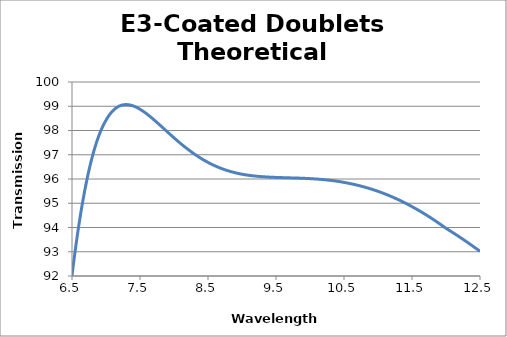
| Category | Transmission |
|---|---|
| 6.5 | 92.016 |
| 6.51 | 92.244 |
| 6.52 | 92.467 |
| 6.53 | 92.685 |
| 6.54 | 92.899 |
| 6.55 | 93.107 |
| 6.56 | 93.311 |
| 6.57 | 93.511 |
| 6.58 | 93.706 |
| 6.59 | 93.896 |
| 6.6 | 94.082 |
| 6.61 | 94.263 |
| 6.62 | 94.441 |
| 6.63 | 94.613 |
| 6.64 | 94.782 |
| 6.65 | 94.946 |
| 6.66 | 95.106 |
| 6.67 | 95.262 |
| 6.68 | 95.413 |
| 6.69 | 95.561 |
| 6.7 | 95.705 |
| 6.71 | 95.845 |
| 6.72 | 95.981 |
| 6.73 | 96.113 |
| 6.74 | 96.241 |
| 6.75 | 96.365 |
| 6.76 | 96.486 |
| 6.77 | 96.603 |
| 6.78 | 96.717 |
| 6.79 | 96.827 |
| 6.8 | 96.934 |
| 6.81 | 97.037 |
| 6.82 | 97.137 |
| 6.83 | 97.234 |
| 6.84 | 97.327 |
| 6.85 | 97.417 |
| 6.86 | 97.504 |
| 6.87 | 97.588 |
| 6.88 | 97.669 |
| 6.89 | 97.747 |
| 6.9 | 97.822 |
| 6.91 | 97.894 |
| 6.92 | 97.963 |
| 6.93 | 98.03 |
| 6.94 | 98.094 |
| 6.95 | 98.155 |
| 6.96 | 98.213 |
| 6.97 | 98.269 |
| 6.98 | 98.323 |
| 6.99 | 98.374 |
| 7.0 | 98.422 |
| 7.01 | 98.471 |
| 7.02 | 98.517 |
| 7.03 | 98.561 |
| 7.04 | 98.603 |
| 7.05 | 98.642 |
| 7.06 | 98.68 |
| 7.07 | 98.716 |
| 7.08 | 98.749 |
| 7.09 | 98.781 |
| 7.1 | 98.81 |
| 7.11 | 98.838 |
| 7.12 | 98.864 |
| 7.13 | 98.889 |
| 7.14 | 98.911 |
| 7.15 | 98.932 |
| 7.16 | 98.951 |
| 7.17 | 98.969 |
| 7.18 | 98.985 |
| 7.19 | 99 |
| 7.2 | 99.013 |
| 7.21 | 99.024 |
| 7.22 | 99.034 |
| 7.23 | 99.043 |
| 7.24 | 99.05 |
| 7.25 | 99.057 |
| 7.26 | 99.061 |
| 7.27 | 99.065 |
| 7.28 | 99.067 |
| 7.29 | 99.068 |
| 7.3 | 99.069 |
| 7.31 | 99.067 |
| 7.32 | 99.065 |
| 7.33 | 99.062 |
| 7.34 | 99.058 |
| 7.35 | 99.053 |
| 7.36 | 99.047 |
| 7.37 | 99.04 |
| 7.38 | 99.032 |
| 7.39 | 99.023 |
| 7.4 | 99.013 |
| 7.41 | 99.003 |
| 7.42 | 98.992 |
| 7.43 | 98.98 |
| 7.44 | 98.967 |
| 7.45 | 98.953 |
| 7.46 | 98.939 |
| 7.47 | 98.924 |
| 7.48 | 98.909 |
| 7.49 | 98.893 |
| 7.5 | 98.876 |
| 7.51 | 98.859 |
| 7.52 | 98.842 |
| 7.53 | 98.823 |
| 7.54 | 98.805 |
| 7.55 | 98.785 |
| 7.56 | 98.766 |
| 7.57 | 98.746 |
| 7.58 | 98.725 |
| 7.59 | 98.704 |
| 7.6 | 98.683 |
| 7.61 | 98.662 |
| 7.62 | 98.64 |
| 7.63 | 98.617 |
| 7.64 | 98.595 |
| 7.65 | 98.572 |
| 7.66 | 98.549 |
| 7.67 | 98.525 |
| 7.68 | 98.502 |
| 7.69 | 98.478 |
| 7.7 | 98.454 |
| 7.71 | 98.43 |
| 7.72 | 98.405 |
| 7.73 | 98.381 |
| 7.74 | 98.356 |
| 7.75 | 98.331 |
| 7.76 | 98.306 |
| 7.77 | 98.281 |
| 7.78 | 98.256 |
| 7.79 | 98.23 |
| 7.8 | 98.205 |
| 7.81 | 98.18 |
| 7.82 | 98.154 |
| 7.83 | 98.129 |
| 7.84 | 98.103 |
| 7.85 | 98.078 |
| 7.86 | 98.052 |
| 7.87 | 98.027 |
| 7.88 | 98.001 |
| 7.89 | 97.975 |
| 7.9 | 97.95 |
| 7.91 | 97.924 |
| 7.92 | 97.899 |
| 7.93 | 97.874 |
| 7.94 | 97.848 |
| 7.95 | 97.823 |
| 7.96 | 97.798 |
| 7.97 | 97.773 |
| 7.98 | 97.748 |
| 7.99 | 97.723 |
| 8.0 | 97.698 |
| 8.01 | 97.674 |
| 8.02 | 97.649 |
| 8.03 | 97.625 |
| 8.04 | 97.6 |
| 8.05 | 97.576 |
| 8.06 | 97.552 |
| 8.07 | 97.528 |
| 8.08 | 97.505 |
| 8.09 | 97.481 |
| 8.1 | 97.458 |
| 8.11 | 97.434 |
| 8.12 | 97.411 |
| 8.13 | 97.388 |
| 8.14 | 97.366 |
| 8.15 | 97.343 |
| 8.16 | 97.321 |
| 8.17 | 97.299 |
| 8.18 | 97.277 |
| 8.19 | 97.255 |
| 8.2 | 97.233 |
| 8.21 | 97.212 |
| 8.22 | 97.191 |
| 8.23 | 97.17 |
| 8.24 | 97.149 |
| 8.25 | 97.128 |
| 8.26 | 97.108 |
| 8.27 | 97.088 |
| 8.28 | 97.068 |
| 8.29 | 97.048 |
| 8.3 | 97.029 |
| 8.31 | 97.009 |
| 8.32 | 96.99 |
| 8.33 | 96.971 |
| 8.34 | 96.953 |
| 8.35 | 96.934 |
| 8.36 | 96.916 |
| 8.37 | 96.898 |
| 8.38 | 96.88 |
| 8.39 | 96.863 |
| 8.4 | 96.846 |
| 8.41 | 96.828 |
| 8.42 | 96.812 |
| 8.43 | 96.795 |
| 8.44 | 96.779 |
| 8.45 | 96.763 |
| 8.46 | 96.747 |
| 8.47 | 96.731 |
| 8.48 | 96.715 |
| 8.49 | 96.7 |
| 8.5 | 96.685 |
| 8.51 | 96.67 |
| 8.52 | 96.656 |
| 8.53 | 96.641 |
| 8.54 | 96.627 |
| 8.55 | 96.613 |
| 8.56 | 96.6 |
| 8.57 | 96.586 |
| 8.58 | 96.573 |
| 8.59 | 96.56 |
| 8.6 | 96.547 |
| 8.61 | 96.535 |
| 8.62 | 96.522 |
| 8.63 | 96.51 |
| 8.64 | 96.498 |
| 8.65 | 96.486 |
| 8.66 | 96.475 |
| 8.67 | 96.464 |
| 8.68 | 96.453 |
| 8.69 | 96.442 |
| 8.7 | 96.431 |
| 8.71 | 96.421 |
| 8.72 | 96.41 |
| 8.73 | 96.4 |
| 8.74 | 96.39 |
| 8.75 | 96.381 |
| 8.76 | 96.371 |
| 8.77 | 96.362 |
| 8.78 | 96.353 |
| 8.79 | 96.344 |
| 8.8 | 96.335 |
| 8.81 | 96.327 |
| 8.82 | 96.318 |
| 8.83 | 96.31 |
| 8.84 | 96.302 |
| 8.85 | 96.294 |
| 8.86 | 96.287 |
| 8.87 | 96.279 |
| 8.88 | 96.272 |
| 8.89 | 96.265 |
| 8.9 | 96.258 |
| 8.91 | 96.251 |
| 8.92 | 96.244 |
| 8.93 | 96.238 |
| 8.94 | 96.232 |
| 8.95 | 96.225 |
| 8.96 | 96.219 |
| 8.97 | 96.214 |
| 8.98 | 96.208 |
| 8.99 | 96.202 |
| 9.0 | 96.197 |
| 9.01 | 96.192 |
| 9.02 | 96.187 |
| 9.03 | 96.182 |
| 9.04 | 96.178 |
| 9.05 | 96.173 |
| 9.06 | 96.169 |
| 9.07 | 96.165 |
| 9.08 | 96.161 |
| 9.09 | 96.157 |
| 9.1 | 96.153 |
| 9.11 | 96.149 |
| 9.12 | 96.145 |
| 9.13 | 96.142 |
| 9.14 | 96.138 |
| 9.15 | 96.135 |
| 9.16 | 96.132 |
| 9.17 | 96.128 |
| 9.18 | 96.125 |
| 9.19 | 96.122 |
| 9.2 | 96.119 |
| 9.21 | 96.117 |
| 9.22 | 96.114 |
| 9.23 | 96.111 |
| 9.24 | 96.109 |
| 9.25 | 96.106 |
| 9.26 | 96.104 |
| 9.27 | 96.101 |
| 9.28 | 96.099 |
| 9.29 | 96.097 |
| 9.3 | 96.095 |
| 9.31 | 96.093 |
| 9.32 | 96.091 |
| 9.33 | 96.089 |
| 9.34 | 96.087 |
| 9.35 | 96.085 |
| 9.36 | 96.084 |
| 9.37 | 96.082 |
| 9.38 | 96.08 |
| 9.39 | 96.079 |
| 9.4 | 96.077 |
| 9.41 | 96.076 |
| 9.42 | 96.075 |
| 9.43 | 96.073 |
| 9.44 | 96.072 |
| 9.45 | 96.071 |
| 9.46 | 96.069 |
| 9.47 | 96.068 |
| 9.48 | 96.067 |
| 9.49 | 96.066 |
| 9.5 | 96.065 |
| 9.51 | 96.064 |
| 9.52 | 96.063 |
| 9.53 | 96.062 |
| 9.54 | 96.061 |
| 9.55 | 96.06 |
| 9.56 | 96.059 |
| 9.57 | 96.058 |
| 9.58 | 96.057 |
| 9.59 | 96.057 |
| 9.6 | 96.056 |
| 9.61 | 96.055 |
| 9.62 | 96.054 |
| 9.63 | 96.053 |
| 9.64 | 96.052 |
| 9.65 | 96.052 |
| 9.66 | 96.051 |
| 9.67 | 96.05 |
| 9.68 | 96.049 |
| 9.69 | 96.049 |
| 9.7 | 96.048 |
| 9.71 | 96.047 |
| 9.72 | 96.046 |
| 9.73 | 96.045 |
| 9.74 | 96.045 |
| 9.75 | 96.044 |
| 9.76 | 96.043 |
| 9.77 | 96.042 |
| 9.78 | 96.041 |
| 9.79 | 96.04 |
| 9.8 | 96.039 |
| 9.81 | 96.039 |
| 9.82 | 96.038 |
| 9.83 | 96.037 |
| 9.84 | 96.036 |
| 9.85 | 96.035 |
| 9.86 | 96.034 |
| 9.87 | 96.033 |
| 9.88 | 96.031 |
| 9.89 | 96.03 |
| 9.9 | 96.029 |
| 9.91 | 96.028 |
| 9.92 | 96.027 |
| 9.93 | 96.025 |
| 9.94 | 96.024 |
| 9.95 | 96.023 |
| 9.96 | 96.021 |
| 9.97 | 96.02 |
| 9.98 | 96.018 |
| 9.99 | 96.017 |
| 10.0 | 96.015 |
| 10.01 | 96.014 |
| 10.02 | 96.012 |
| 10.03 | 96.011 |
| 10.04 | 96.009 |
| 10.05 | 96.007 |
| 10.06 | 96.005 |
| 10.07 | 96.004 |
| 10.08 | 96.002 |
| 10.09 | 96 |
| 10.1 | 95.998 |
| 10.11 | 95.996 |
| 10.12 | 95.993 |
| 10.13 | 95.991 |
| 10.14 | 95.989 |
| 10.15 | 95.987 |
| 10.16 | 95.984 |
| 10.17 | 95.982 |
| 10.18 | 95.979 |
| 10.19 | 95.977 |
| 10.2 | 95.974 |
| 10.21 | 95.972 |
| 10.22 | 95.969 |
| 10.23 | 95.966 |
| 10.24 | 95.963 |
| 10.25 | 95.96 |
| 10.26 | 95.957 |
| 10.27 | 95.954 |
| 10.28 | 95.951 |
| 10.29 | 95.948 |
| 10.3 | 95.944 |
| 10.31 | 95.941 |
| 10.32 | 95.937 |
| 10.33 | 95.934 |
| 10.34 | 95.93 |
| 10.35 | 95.926 |
| 10.36 | 95.923 |
| 10.37 | 95.919 |
| 10.38 | 95.915 |
| 10.39 | 95.911 |
| 10.4 | 95.907 |
| 10.41 | 95.902 |
| 10.42 | 95.898 |
| 10.43 | 95.894 |
| 10.44 | 95.889 |
| 10.45 | 95.885 |
| 10.46 | 95.88 |
| 10.47 | 95.875 |
| 10.48 | 95.87 |
| 10.49 | 95.865 |
| 10.5 | 95.86 |
| 10.51 | 95.855 |
| 10.52 | 95.85 |
| 10.53 | 95.845 |
| 10.54 | 95.839 |
| 10.55 | 95.834 |
| 10.56 | 95.828 |
| 10.57 | 95.823 |
| 10.58 | 95.817 |
| 10.59 | 95.811 |
| 10.6 | 95.805 |
| 10.61 | 95.799 |
| 10.62 | 95.793 |
| 10.63 | 95.787 |
| 10.64 | 95.781 |
| 10.65 | 95.775 |
| 10.66 | 95.768 |
| 10.67 | 95.762 |
| 10.68 | 95.755 |
| 10.69 | 95.748 |
| 10.7 | 95.742 |
| 10.71 | 95.735 |
| 10.72 | 95.728 |
| 10.73 | 95.721 |
| 10.74 | 95.714 |
| 10.75 | 95.706 |
| 10.76 | 95.699 |
| 10.77 | 95.692 |
| 10.78 | 95.684 |
| 10.79 | 95.676 |
| 10.8 | 95.669 |
| 10.81 | 95.661 |
| 10.82 | 95.653 |
| 10.83 | 95.645 |
| 10.84 | 95.637 |
| 10.85 | 95.628 |
| 10.86 | 95.62 |
| 10.87 | 95.611 |
| 10.88 | 95.603 |
| 10.89 | 95.594 |
| 10.9 | 95.585 |
| 10.91 | 95.576 |
| 10.92 | 95.567 |
| 10.93 | 95.558 |
| 10.94 | 95.549 |
| 10.95 | 95.54 |
| 10.96 | 95.53 |
| 10.97 | 95.521 |
| 10.98 | 95.511 |
| 10.99 | 95.502 |
| 11.0 | 95.492 |
| 11.01 | 95.482 |
| 11.02 | 95.472 |
| 11.03 | 95.461 |
| 11.04 | 95.451 |
| 11.05 | 95.441 |
| 11.06 | 95.43 |
| 11.07 | 95.42 |
| 11.08 | 95.409 |
| 11.09 | 95.398 |
| 11.1 | 95.387 |
| 11.11 | 95.376 |
| 11.12 | 95.365 |
| 11.13 | 95.354 |
| 11.14 | 95.343 |
| 11.15 | 95.331 |
| 11.16 | 95.319 |
| 11.17 | 95.308 |
| 11.18 | 95.296 |
| 11.19 | 95.284 |
| 11.2 | 95.272 |
| 11.21 | 95.26 |
| 11.22 | 95.248 |
| 11.23 | 95.235 |
| 11.24 | 95.223 |
| 11.25 | 95.21 |
| 11.26 | 95.198 |
| 11.27 | 95.185 |
| 11.28 | 95.172 |
| 11.29 | 95.159 |
| 11.3 | 95.146 |
| 11.31 | 95.133 |
| 11.32 | 95.12 |
| 11.33 | 95.106 |
| 11.34 | 95.093 |
| 11.35 | 95.079 |
| 11.36 | 95.065 |
| 11.37 | 95.051 |
| 11.38 | 95.037 |
| 11.39 | 95.023 |
| 11.4 | 95.009 |
| 11.41 | 94.995 |
| 11.42 | 94.98 |
| 11.43 | 94.966 |
| 11.44 | 94.951 |
| 11.45 | 94.937 |
| 11.46 | 94.922 |
| 11.47 | 94.907 |
| 11.48 | 94.892 |
| 11.49 | 94.877 |
| 11.5 | 94.861 |
| 11.51 | 94.846 |
| 11.52 | 94.831 |
| 11.53 | 94.815 |
| 11.54 | 94.799 |
| 11.55 | 94.784 |
| 11.56 | 94.768 |
| 11.57 | 94.752 |
| 11.58 | 94.736 |
| 11.59 | 94.719 |
| 11.6 | 94.703 |
| 11.61 | 94.687 |
| 11.62 | 94.67 |
| 11.63 | 94.653 |
| 11.64 | 94.637 |
| 11.65 | 94.62 |
| 11.66 | 94.603 |
| 11.67 | 94.586 |
| 11.68 | 94.569 |
| 11.69 | 94.551 |
| 11.7 | 94.534 |
| 11.71 | 94.517 |
| 11.72 | 94.499 |
| 11.73 | 94.481 |
| 11.74 | 94.464 |
| 11.75 | 94.446 |
| 11.76 | 94.428 |
| 11.77 | 94.41 |
| 11.78 | 94.391 |
| 11.79 | 94.373 |
| 11.8 | 94.355 |
| 11.81 | 94.336 |
| 11.82 | 94.318 |
| 11.83 | 94.299 |
| 11.84 | 94.28 |
| 11.85 | 94.261 |
| 11.86 | 94.242 |
| 11.87 | 94.223 |
| 11.88 | 94.204 |
| 11.89 | 94.185 |
| 11.9 | 94.165 |
| 11.91 | 94.146 |
| 11.92 | 94.126 |
| 11.93 | 94.107 |
| 11.94 | 94.087 |
| 11.95 | 94.067 |
| 11.96 | 94.047 |
| 11.97 | 94.027 |
| 11.98 | 94.007 |
| 11.99 | 93.987 |
| 12.0 | 93.966 |
| 12.01 | 93.949 |
| 12.02 | 93.932 |
| 12.03 | 93.914 |
| 12.04 | 93.897 |
| 12.05 | 93.879 |
| 12.06 | 93.861 |
| 12.07 | 93.843 |
| 12.08 | 93.826 |
| 12.09 | 93.808 |
| 12.1 | 93.79 |
| 12.11 | 93.772 |
| 12.12 | 93.754 |
| 12.13 | 93.736 |
| 12.14 | 93.717 |
| 12.15 | 93.699 |
| 12.16 | 93.681 |
| 12.17 | 93.662 |
| 12.18 | 93.644 |
| 12.19 | 93.625 |
| 12.2 | 93.607 |
| 12.21 | 93.588 |
| 12.22 | 93.569 |
| 12.23 | 93.55 |
| 12.24 | 93.532 |
| 12.25 | 93.513 |
| 12.26 | 93.494 |
| 12.27 | 93.475 |
| 12.28 | 93.455 |
| 12.29 | 93.436 |
| 12.3 | 93.417 |
| 12.31 | 93.398 |
| 12.32 | 93.378 |
| 12.33 | 93.359 |
| 12.34 | 93.339 |
| 12.35 | 93.32 |
| 12.36 | 93.3 |
| 12.37 | 93.28 |
| 12.38 | 93.261 |
| 12.39 | 93.241 |
| 12.4 | 93.221 |
| 12.41 | 93.201 |
| 12.42 | 93.181 |
| 12.43 | 93.161 |
| 12.44 | 93.141 |
| 12.45 | 93.121 |
| 12.46 | 93.101 |
| 12.47 | 93.08 |
| 12.48 | 93.06 |
| 12.49 | 93.04 |
| 12.5 | 93.019 |